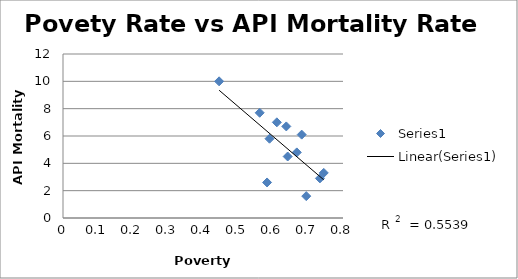
| Category | Series 0 |
|---|---|
| 0.668 | 4.8 |
| 0.682 | 6.1 |
| 0.695 | 1.6 |
| 0.642 | 4.5 |
| 0.583 | 2.6 |
| 0.611 | 7 |
| 0.638 | 6.7 |
| 0.734 | 2.9 |
| 0.562 | 7.7 |
| 0.446 | 10 |
| 0.59 | 5.8 |
| 0.745 | 3.3 |